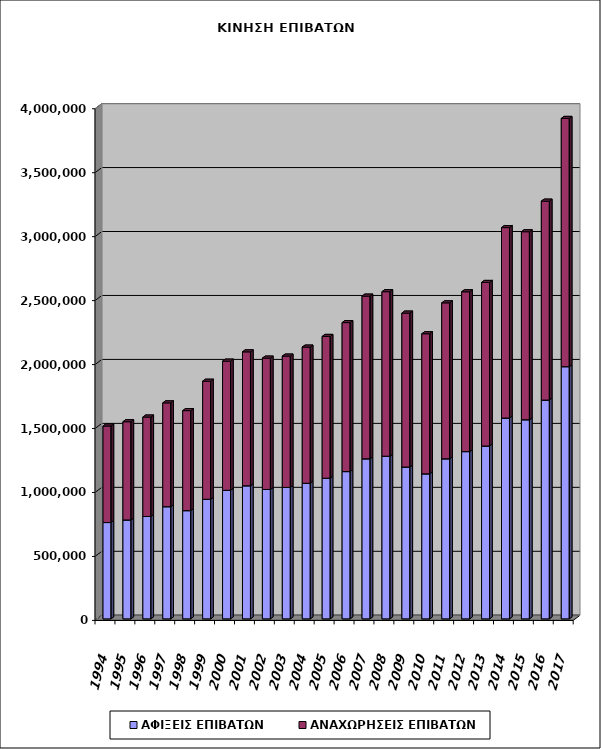
| Category | ΑΦΙΞΕΙΣ ΕΠΙΒΑΤΩΝ | ΑΝΑΧΩΡΗΣΕΙΣ ΕΠΙΒΑΤΩΝ |
|---|---|---|
| 1994.0 | 753040 | 754601 |
| 1995.0 | 773275 | 767859 |
| 1996.0 | 800500 | 777202 |
| 1997.0 | 877037 | 811393 |
| 1998.0 | 846092 | 781834 |
| 1999.0 | 935030 | 922715 |
| 2000.0 | 1005051 | 1009593 |
| 2001.0 | 1040545 | 1046908 |
| 2002.0 | 1011462 | 1026911 |
| 2003.0 | 1027767 | 1026478 |
| 2004.0 | 1060064 | 1064434 |
| 2005.0 | 1099516 | 1108560 |
| 2006.0 | 1151395 | 1164626 |
| 2007.0 | 1251308 | 1271711 |
| 2008.0 | 1271776 | 1285900 |
| 2009.0 | 1187233 | 1203072 |
| 2010.0 | 1133704 | 1094976 |
| 2011.0 | 1251433 | 1219070 |
| 2012.0 | 1307537 | 1249551 |
| 2013.0 | 1351378 | 1278590 |
| 2014.0 | 1569814 | 1488894 |
| 2015.0 | 1556788 | 1469732 |
| 2016.0 | 1710606 | 1554997 |
| 2017.0 | 1971612 | 1940763 |